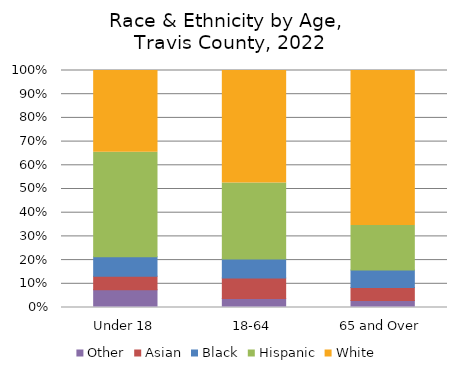
| Category | Other | Asian | Black | Hispanic | White |
|---|---|---|---|---|---|
| Under 18 | 0.074 | 0.057 | 0.083 | 0.441 | 0.345 |
| 18-64 | 0.038 | 0.086 | 0.081 | 0.321 | 0.474 |
| 65 and Over | 0.029 | 0.055 | 0.074 | 0.188 | 0.654 |